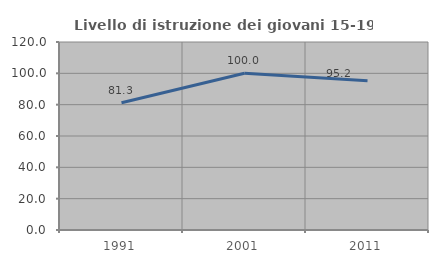
| Category | Livello di istruzione dei giovani 15-19 anni |
|---|---|
| 1991.0 | 81.25 |
| 2001.0 | 100 |
| 2011.0 | 95.238 |